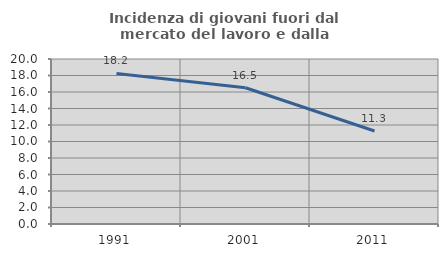
| Category | Incidenza di giovani fuori dal mercato del lavoro e dalla formazione  |
|---|---|
| 1991.0 | 18.248 |
| 2001.0 | 16.509 |
| 2011.0 | 11.268 |